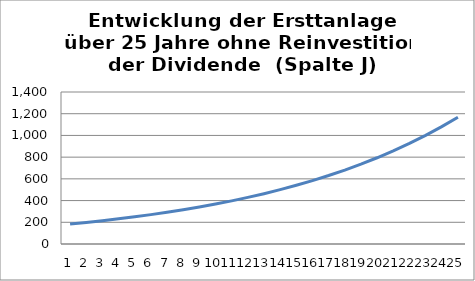
| Category | Series 0 |
|---|---|
| 0 | 184.062 |
| 1 | 198.788 |
| 2 | 214.691 |
| 3 | 231.866 |
| 4 | 250.415 |
| 5 | 270.448 |
| 6 | 292.084 |
| 7 | 315.451 |
| 8 | 340.687 |
| 9 | 367.942 |
| 10 | 397.377 |
| 11 | 429.167 |
| 12 | 463.501 |
| 13 | 500.581 |
| 14 | 540.627 |
| 15 | 583.877 |
| 16 | 630.588 |
| 17 | 681.035 |
| 18 | 735.517 |
| 19 | 794.359 |
| 20 | 857.907 |
| 21 | 926.54 |
| 22 | 1000.663 |
| 23 | 1080.716 |
| 24 | 1167.174 |